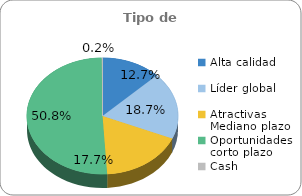
| Category | Series 0 |
|---|---|
| Alta calidad | 0.127 |
| Líder global | 0.187 |
| Atractivas Mediano plazo | 0.177 |
| Oportunidades corto plazo | 0.508 |
| Cash | 0.002 |